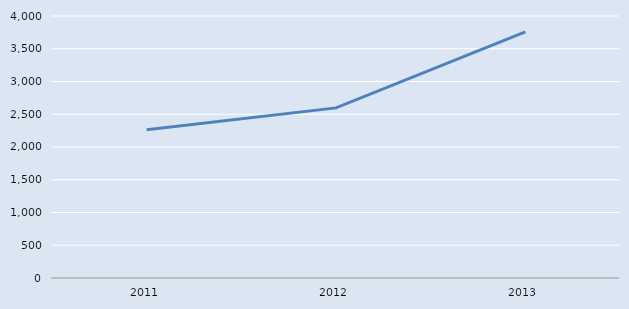
| Category | Series 0 |
|---|---|
| 2011.0 | 2264 |
| 2012.0 | 2597 |
| 2013.0 | 3759 |